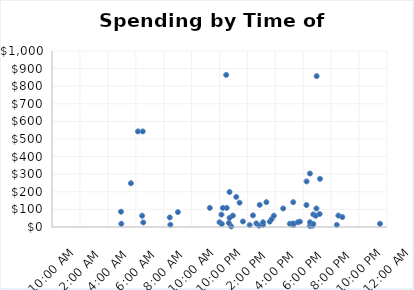
| Category | Final Amount |
|---|---|
| 0.2059836576436891 | 86.9 |
| 0.20694304533201924 | 18.47 |
| 0.23561808003811024 | 248.75 |
| 0.2565894207479469 | 543.13 |
| 0.2690499749960382 | 64.09 |
| 0.27091141377642547 | 543.13 |
| 0.2725163334106441 | 26.07 |
| 0.3515039483172967 | 54.31 |
| 0.35327916758481814 | 13.04 |
| 0.3758616827052813 | 84.73 |
| 0.4711449665857851 | 108.63 |
| 0.5 | 27.16 |
| 0.5058168187705858 | 70.61 |
| 0.506989197258562 | 17.38 |
| 0.51 | 108.63 |
| 0.52 | 864.28 |
| 0.5214745233070734 | 108.63 |
| 0.5279810255729169 | 22.81 |
| 0.53 | 52.14 |
| 0.53 | 199.02 |
| 0.5350416852222462 | 3.26 |
| 0.54 | 65.18 |
| 0.55 | 171.12 |
| 0.56 | 138.26 |
| 0.57 | 31.5 |
| 0.59 | 10.86 |
| 0.6 | 66.26 |
| 0.61 | 20.64 |
| 0.6178290344632255 | 7.6 |
| 0.62 | 125.86 |
| 0.63 | 11.95 |
| 0.63 | 27.16 |
| 0.64 | 141.21 |
| 0.65 | 30.42 |
| 0.655462962962963 | 44.54 |
| 0.662188191718139 | 64.09 |
| 0.6901388888888889 | 105.37 |
| 0.71 | 18.47 |
| 0.72 | 10.86 |
| 0.72 | 141.21 |
| 0.72 | 20.64 |
| 0.7337454756850129 | 27.16 |
| 0.74 | 30.42 |
| 0.7596314277556854 | 124.92 |
| 0.76 | 259.16 |
| 0.77 | 5.43 |
| 0.77 | 27.16 |
| 0.77 | 304.15 |
| 0.7775560699279398 | 7.6 |
| 0.78 | 17.38 |
| 0.78 | 71.69 |
| 0.7871454158278426 | 64.09 |
| 0.7893803583154396 | 105.37 |
| 0.79 | 857.46 |
| 0.7988773148148148 | 73.87 |
| 0.8 | 273.74 |
| 0.850222481211394 | 11.95 |
| 0.8548177502034898 | 65.18 |
| 0.8666963500868531 | 56.49 |
| 0.9789925660777248 | 18.47 |